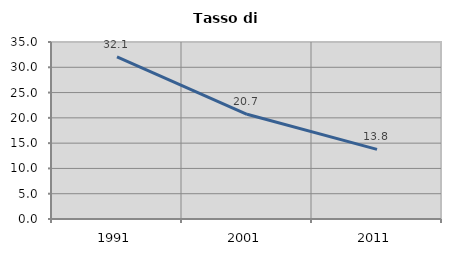
| Category | Tasso di disoccupazione   |
|---|---|
| 1991.0 | 32.061 |
| 2001.0 | 20.705 |
| 2011.0 | 13.778 |